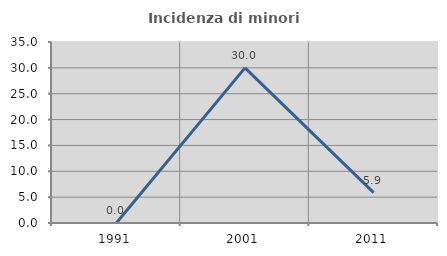
| Category | Incidenza di minori stranieri |
|---|---|
| 1991.0 | 0 |
| 2001.0 | 30 |
| 2011.0 | 5.882 |